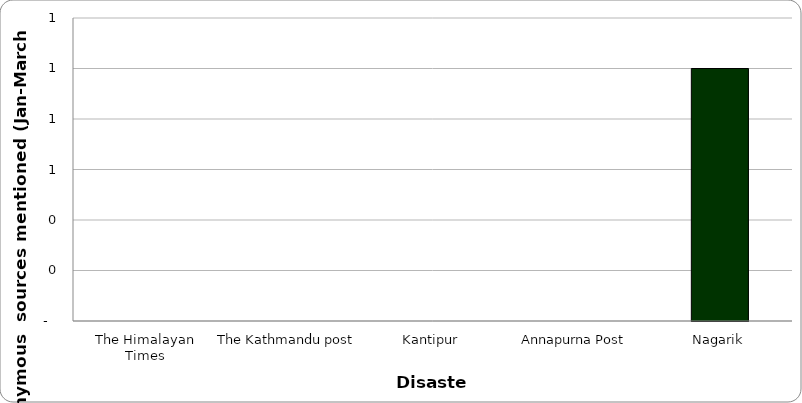
| Category | Disaster |
|---|---|
| The Himalayan Times | 0 |
| The Kathmandu post | 0 |
| Kantipur | 0 |
| Annapurna Post | 0 |
| Nagarik | 1 |